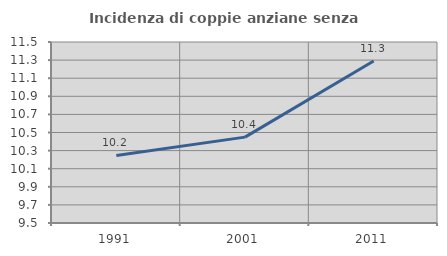
| Category | Incidenza di coppie anziane senza figli  |
|---|---|
| 1991.0 | 10.246 |
| 2001.0 | 10.449 |
| 2011.0 | 11.29 |